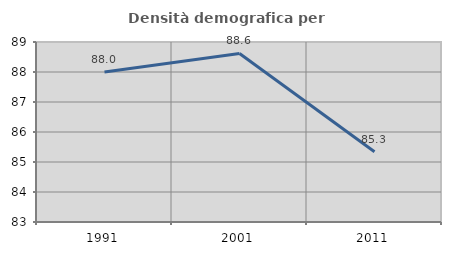
| Category | Densità demografica |
|---|---|
| 1991.0 | 87.997 |
| 2001.0 | 88.618 |
| 2011.0 | 85.342 |